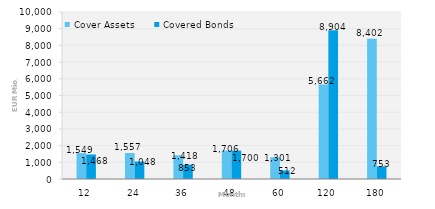
| Category | Cover Assets | Covered Bonds |
|---|---|---|
| 12.0 | 1549.324 | 1467.841 |
| 24.0 | 1556.729 | 1048 |
| 36.0 | 1417.822 | 853 |
| 48.0 | 1705.756 | 1699.5 |
| 60.0 | 1300.92 | 512 |
| 120.0 | 5662.317 | 8903.782 |
| 180.0 | 8401.897 | 752.747 |